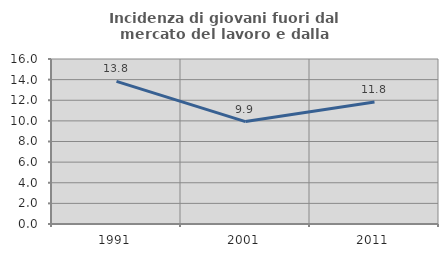
| Category | Incidenza di giovani fuori dal mercato del lavoro e dalla formazione  |
|---|---|
| 1991.0 | 13.835 |
| 2001.0 | 9.933 |
| 2011.0 | 11.826 |